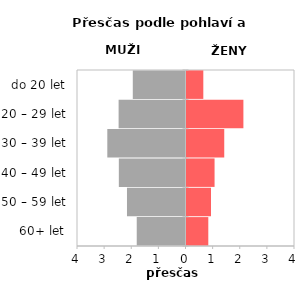
| Category | Přesčas |
|---|---|
| 60+ let | 0.804 |
| 50 – 59 let | 0.904 |
| 40 – 49 let | 1.035 |
| 30 – 39 let | 1.392 |
| 20 – 29 let | 2.098 |
| do 20 let | 0.62 |